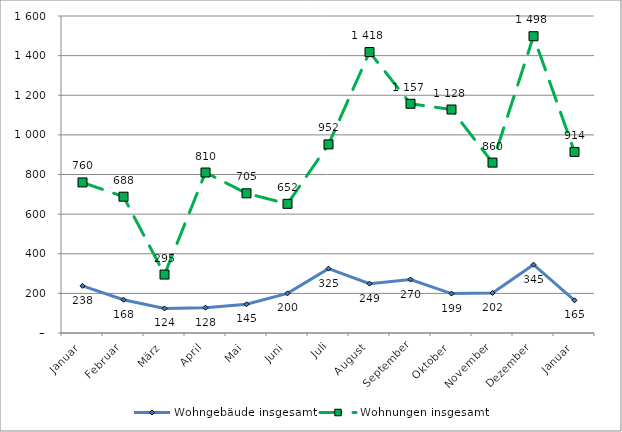
| Category | Wohngebäude insgesamt | Wohnungen insgesamt |
|---|---|---|
| Januar | 238 | 760 |
| Februar | 168 | 688 |
| März | 124 | 295 |
| April | 128 | 810 |
| Mai | 145 | 705 |
| Juni | 200 | 652 |
| Juli | 325 | 952 |
| August | 249 | 1418 |
| September | 270 | 1157 |
| Oktober | 199 | 1128 |
| November | 202 | 860 |
| Dezember | 345 | 1498 |
| Januar | 165 | 914 |